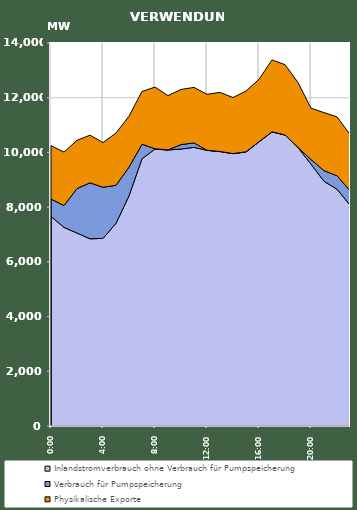
| Category | Inlandstromverbrauch ohne Verbrauch für Pumpspeicherung | Verbrauch für Pumpspeicherung | Physikalische Exporte |
|---|---|---|---|
| 2007-01-17 | 7658.57 | 638.583 | 1949.646 |
| 2007-01-17 01:00:00 | 7259.815 | 798.275 | 1955.6 |
| 2007-01-17 02:00:00 | 7053.424 | 1625.06 | 1762.72 |
| 2007-01-17 03:00:00 | 6842.289 | 2046.587 | 1742.476 |
| 2007-01-17 04:00:00 | 6858.064 | 1867.716 | 1634.059 |
| 2007-01-17 05:00:00 | 7406.697 | 1390.931 | 1912.841 |
| 2007-01-17 06:00:00 | 8413.526 | 1048.186 | 1862.508 |
| 2007-01-17 07:00:00 | 9767.844 | 532.207 | 1929.075 |
| 2007-01-17 08:00:00 | 10120.022 | 14.063 | 2254.699 |
| 2007-01-17 09:00:00 | 10089.274 | 2.19 | 1984.472 |
| 2007-01-17 10:00:00 | 10123.221 | 162.893 | 2016.133 |
| 2007-01-17 11:00:00 | 10184.761 | 162.995 | 2028.942 |
| 2007-01-17 12:00:00 | 10075.992 | 3.255 | 2045.317 |
| 2007-01-17 13:00:00 | 10030.384 | 4.901 | 2158.488 |
| 2007-01-17 14:00:00 | 9954.862 | 3.29 | 2047.857 |
| 2007-01-17 15:00:00 | 10018.326 | 3.901 | 2222.028 |
| 2007-01-17 16:00:00 | 10387.29 | 3.079 | 2283.046 |
| 2007-01-17 17:00:00 | 10749.026 | 3.629 | 2627.76 |
| 2007-01-17 18:00:00 | 10637.431 | 2.816 | 2569.747 |
| 2007-01-17 19:00:00 | 10176.946 | 2.792 | 2376.721 |
| 2007-01-17 20:00:00 | 9570.54 | 170.224 | 1876.687 |
| 2007-01-17 21:00:00 | 8945.253 | 387.539 | 2122.375 |
| 2007-01-17 22:00:00 | 8655.57 | 493.54 | 2151.273 |
| 2007-01-17 23:00:00 | 8075.155 | 528.506 | 2055.051 |